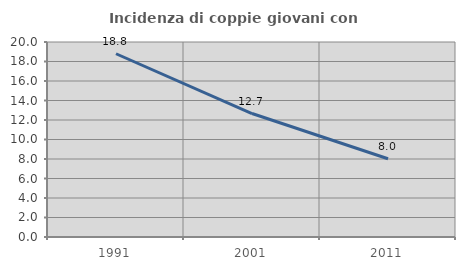
| Category | Incidenza di coppie giovani con figli |
|---|---|
| 1991.0 | 18.795 |
| 2001.0 | 12.662 |
| 2011.0 | 8.03 |